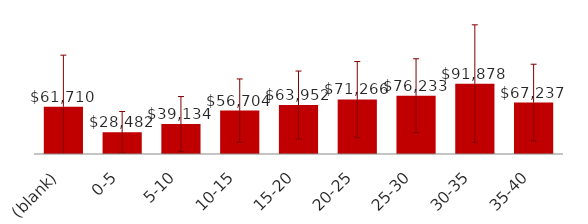
| Category | Total |
|---|---|
| (blank) | 61709.658 |
| 0-5 | 28482.113 |
| 5-10 | 39133.844 |
| 10-15 | 56704.162 |
| 15-20 | 63951.941 |
| 20-25 | 71265.649 |
| 25-30 | 76233.362 |
| 30-35 | 91877.626 |
| 35-40 | 67237.285 |